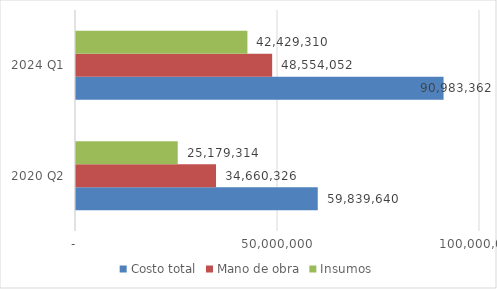
| Category | Costo total | Mano de obra | Insumos |
|---|---|---|---|
| 2020 Q2 | 59839640.335 | 34660326.001 | 25179314.333 |
| 2024 Q1 | 90983362.398 | 48554052 | 42429310.398 |